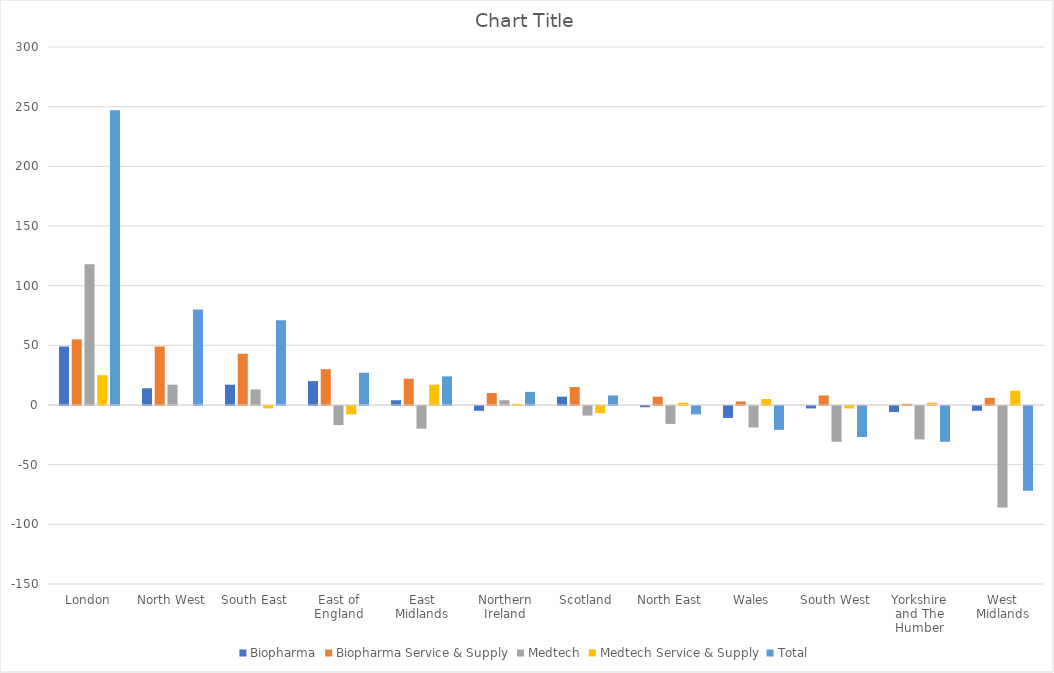
| Category | Biopharma | Biopharma Service & Supply | Medtech | Medtech Service & Supply | Total |
|---|---|---|---|---|---|
| London | 49 | 55 | 118 | 25 | 247 |
| North West | 14 | 49 | 17 | 0 | 80 |
| South East | 17 | 43 | 13 | -2 | 71 |
| East of England | 20 | 30 | -16 | -7 | 27 |
| East Midlands | 4 | 22 | -19 | 17 | 24 |
| Northern Ireland | -4 | 10 | 4 | 1 | 11 |
| Scotland | 7 | 15 | -8 | -6 | 8 |
| North East | -1 | 7 | -15 | 2 | -7 |
| Wales | -10 | 3 | -18 | 5 | -20 |
| South West | -2 | 8 | -30 | -2 | -26 |
| Yorkshire and The Humber | -5 | 1 | -28 | 2 | -30 |
| West Midlands | -4 | 6 | -85 | 12 | -71 |